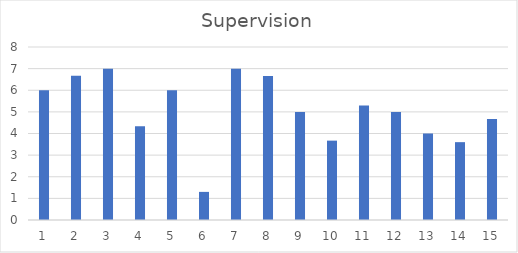
| Category | Supervision |
|---|---|
| 0 | 6 |
| 1 | 6.67 |
| 2 | 7 |
| 3 | 4.33 |
| 4 | 6 |
| 5 | 1.3 |
| 6 | 7 |
| 7 | 6.66 |
| 8 | 5 |
| 9 | 3.67 |
| 10 | 5.3 |
| 11 | 5 |
| 12 | 4 |
| 13 | 3.6 |
| 14 | 4.67 |